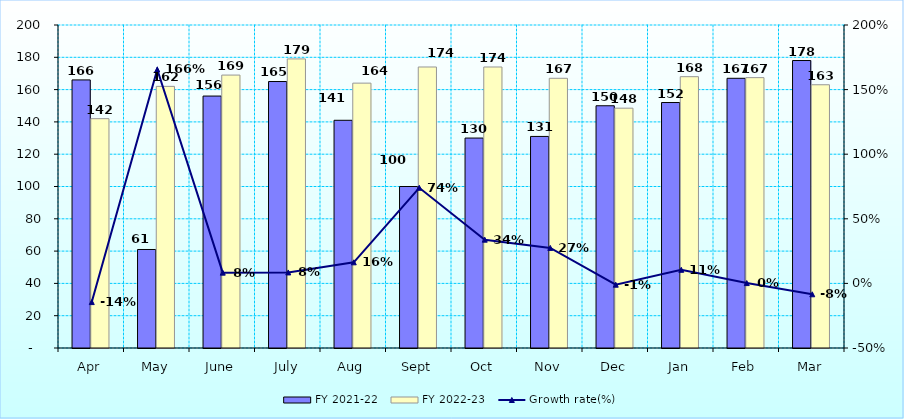
| Category | FY 2021-22 | FY 2022-23 |
|---|---|---|
| Apr | 166 | 142 |
| May | 61 | 162 |
| June | 156 | 169 |
| July | 165 | 179 |
| Aug | 141 | 164 |
| Sept | 100 | 174 |
| Oct | 130 | 174 |
| Nov | 131 | 167 |
| Dec | 150 | 148.495 |
| Jan | 152 | 168 |
| Feb | 167 | 167.408 |
| Mar | 178 | 163 |